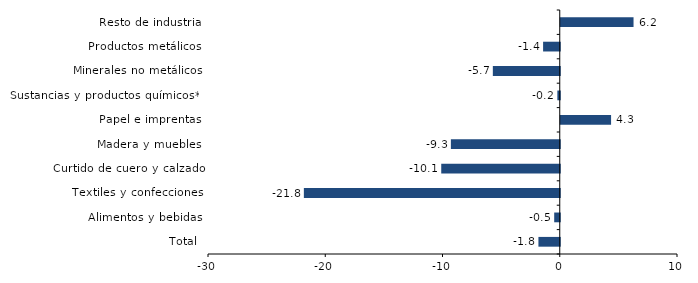
| Category | Series 0 |
|---|---|
| Total | -1.819 |
| Alimentos y bebidas | -0.474 |
| Textiles y confecciones | -21.824 |
| Curtido de cuero y calzado | -10.107 |
| Madera y muebles | -9.286 |
| Papel e imprentas | 4.292 |
| Sustancias y productos químicos** | -0.204 |
| Minerales no metálicos | -5.707 |
| Productos metálicos | -1.421 |
| Resto de industria | 6.208 |